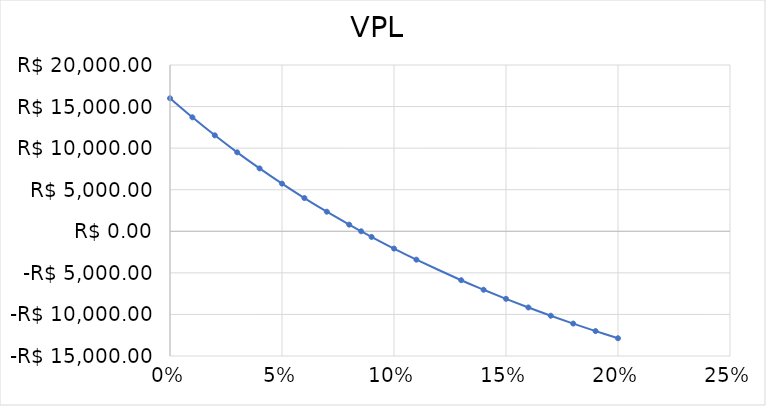
| Category | VPL |
|---|---|
| 0.0 | 16000 |
| 0.01 | 13707.009 |
| 0.02 | 11541.929 |
| 0.03 | 9496.138 |
| 0.04 | 7561.685 |
| 0.05 | 5731.228 |
| 0.06 | 3997.988 |
| 0.07 | 2355.693 |
| 0.08 | 798.54 |
| 0.08534011687133103 | 0 |
| 0.09 | -678.845 |
| 0.1 | -2081.444 |
| 0.11 | -3413.878 |
| 0.13 | -5885.111 |
| 0.14 | -7031.601 |
| 0.15 | -8123.358 |
| 0.16 | -9163.592 |
| 0.17 | -10155.295 |
| 0.18 | -11101.256 |
| 0.19 | -12004.078 |
| 0.2 | -12866.191 |